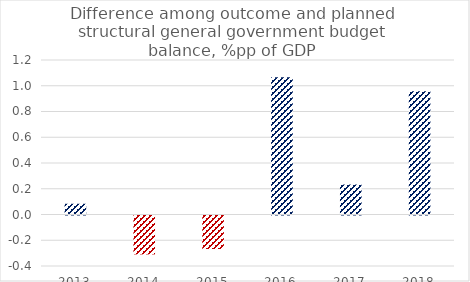
| Category | Series 0 |
|---|---|
| 2013.0 | 0.083 |
| 2014.0 | -0.302 |
| 2015.0 | -0.26 |
| 2016.0 | 1.066 |
| 2017.0 | 0.233 |
| 2018.0 | 0.957 |